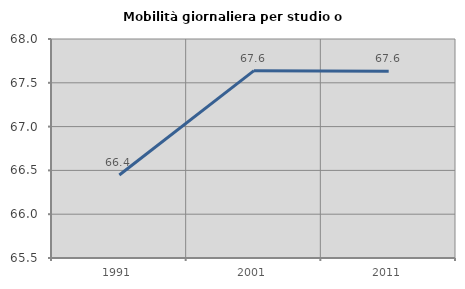
| Category | Mobilità giornaliera per studio o lavoro |
|---|---|
| 1991.0 | 66.448 |
| 2001.0 | 67.638 |
| 2011.0 | 67.632 |